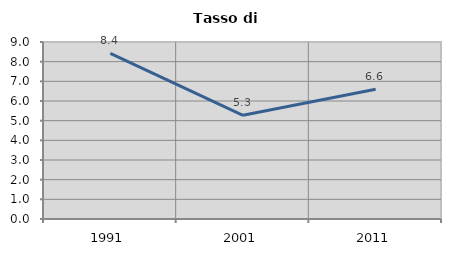
| Category | Tasso di disoccupazione   |
|---|---|
| 1991.0 | 8.418 |
| 2001.0 | 5.274 |
| 2011.0 | 6.596 |